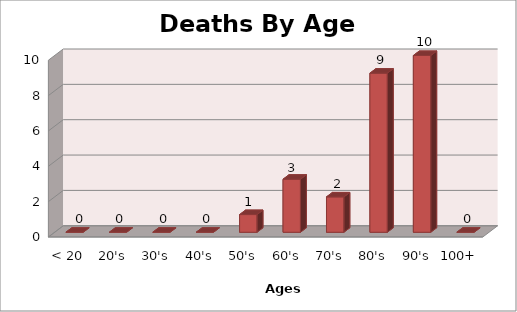
| Category | Series 0 |
|---|---|
| < 20 | 0 |
| 20's | 0 |
| 30's | 0 |
| 40's | 0 |
| 50's | 1 |
| 60's | 3 |
| 70's | 2 |
| 80's | 9 |
| 90's | 10 |
| 100+ | 0 |